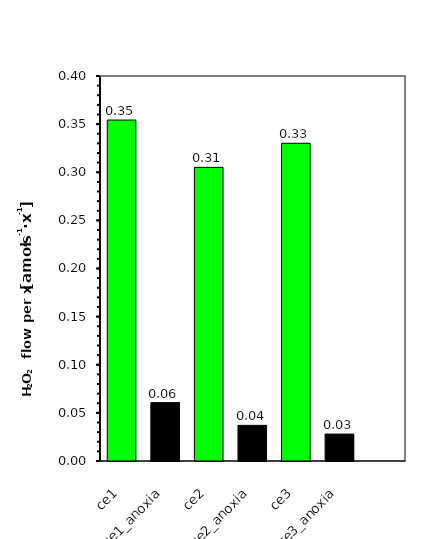
| Category | H2O2 flow per x |
|---|---|
| ce1 | 0.354 |
| ce1_anoxia | 0.061 |
| ce2 | 0.305 |
| ce2_anoxia | 0.037 |
| ce3 | 0.33 |
| ce3_anoxia | 0.028 |